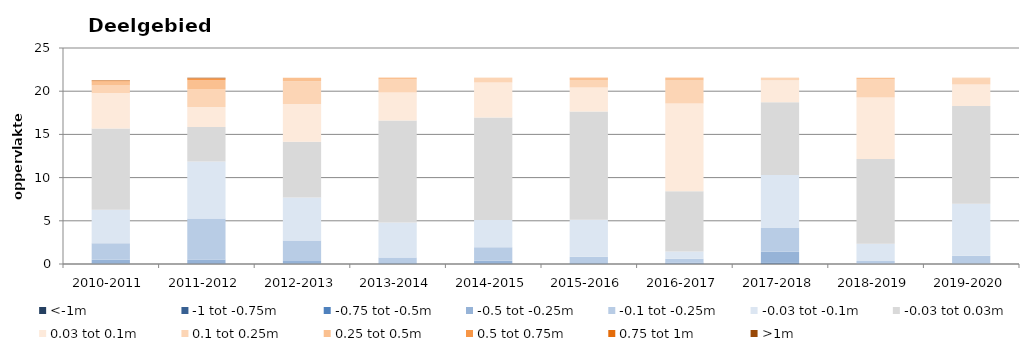
| Category | <-1m | -1 tot -0.75m | -0.75 tot -0.5m | -0.5 tot -0.25m | -0.1 tot -0.25m | -0.03 tot -0.1m | -0.03 tot 0.03m | 0.03 tot 0.1m | 0.1 tot 0.25m | 0.25 tot 0.5m | 0.5 tot 0.75m | 0.75 tot 1m | >1m |
|---|---|---|---|---|---|---|---|---|---|---|---|---|---|
| 2010-2011 | 0 | 0.001 | 0.018 | 0.48 | 1.893 | 3.9 | 9.397 | 4.092 | 0.893 | 0.443 | 0.097 | 0.036 | 0.024 |
| 2011-2012 | 0.004 | 0.009 | 0.041 | 0.465 | 4.755 | 6.578 | 4.003 | 2.319 | 2.084 | 1.022 | 0.195 | 0.034 | 0.06 |
| 2012-2013 | 0 | 0.002 | 0.027 | 0.322 | 2.366 | 4.985 | 6.449 | 4.364 | 2.629 | 0.41 | 0.013 | 0 | 0 |
| 2013-2014 | 0.001 | 0.002 | 0.012 | 0.106 | 0.64 | 4.056 | 11.787 | 3.237 | 1.525 | 0.172 | 0.013 | 0.011 | 0.004 |
| 2014-2015 | 0.009 | 0.015 | 0.047 | 0.298 | 1.582 | 3.136 | 11.883 | 4.047 | 0.502 | 0.044 | 0.004 | 0 | 0 |
| 2015-2016 | 0.001 | 0.002 | 0.019 | 0.093 | 0.728 | 4.268 | 12.544 | 2.761 | 0.879 | 0.216 | 0.043 | 0.011 | 0.004 |
| 2016-2017 | 0.004 | 0.01 | 0.033 | 0.126 | 0.425 | 0.862 | 6.953 | 10.171 | 2.649 | 0.289 | 0.036 | 0.007 | 0.003 |
| 2017-2018 | 0.002 | 0.016 | 0.154 | 1.239 | 2.769 | 6.108 | 8.423 | 2.548 | 0.274 | 0.023 | 0.008 | 0.002 | 0.001 |
| 2018-2019 | 0 | 0 | 0.003 | 0.02 | 0.324 | 2.001 | 9.814 | 7.094 | 2.112 | 0.19 | 0.007 | 0.002 | 0.001 |
| 2019-2020 | 0 | 0 | 0.006 | 0.058 | 0.895 | 6.002 | 11.317 | 2.489 | 0.735 | 0.06 | 0.006 | 0 | 0 |